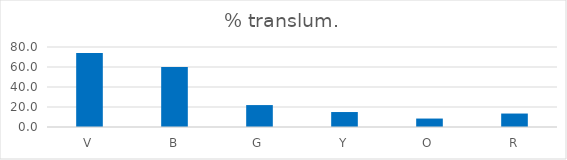
| Category | % translum. |
|---|---|
| V | 73.952 |
| B | 60.101 |
| G | 21.928 |
| Y | 14.965 |
| O | 8.451 |
| R | 13.462 |